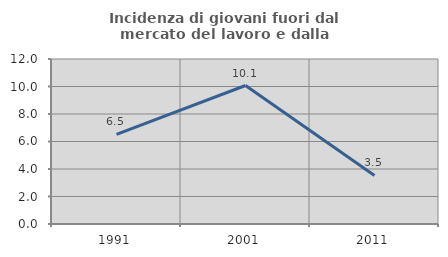
| Category | Incidenza di giovani fuori dal mercato del lavoro e dalla formazione  |
|---|---|
| 1991.0 | 6.522 |
| 2001.0 | 10.072 |
| 2011.0 | 3.529 |